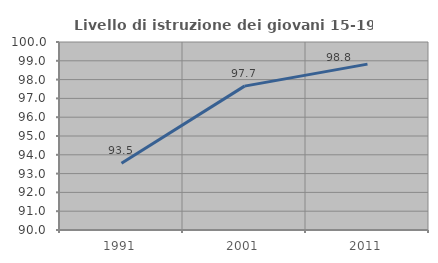
| Category | Livello di istruzione dei giovani 15-19 anni |
|---|---|
| 1991.0 | 93.548 |
| 2001.0 | 97.653 |
| 2011.0 | 98.824 |